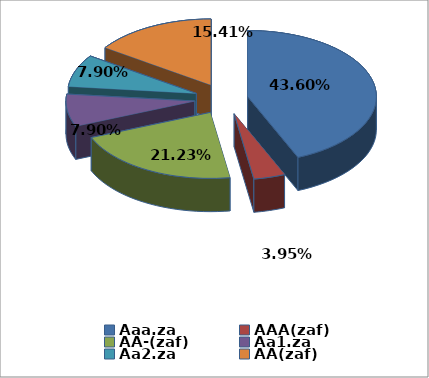
| Category | Series 0 |
|---|---|
| Aaa.za | 0.436 |
| AAA(zaf) | 0.04 |
| AA-(zaf) | 0.212 |
| Aa1.za | 0.079 |
| Aa2.za | 0.079 |
| AA(zaf) | 0.154 |